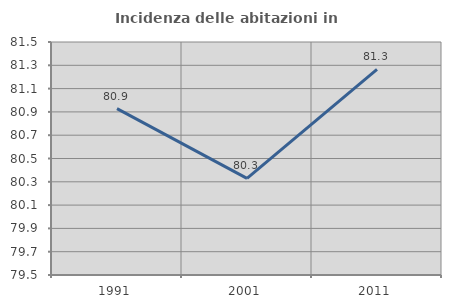
| Category | Incidenza delle abitazioni in proprietà  |
|---|---|
| 1991.0 | 80.928 |
| 2001.0 | 80.329 |
| 2011.0 | 81.265 |